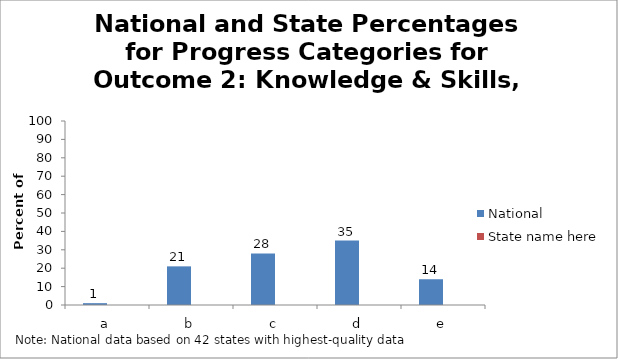
| Category | National | State name here |
|---|---|---|
| a | 1 |  |
| b | 21 |  |
| c | 28 |  |
| d | 35 |  |
| e | 14 |  |